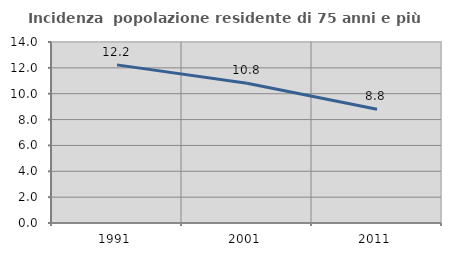
| Category | Incidenza  popolazione residente di 75 anni e più |
|---|---|
| 1991.0 | 12.23 |
| 2001.0 | 10.811 |
| 2011.0 | 8.805 |